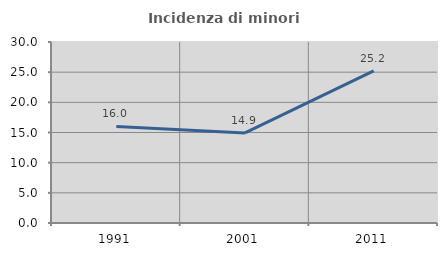
| Category | Incidenza di minori stranieri |
|---|---|
| 1991.0 | 16 |
| 2001.0 | 14.935 |
| 2011.0 | 25.219 |